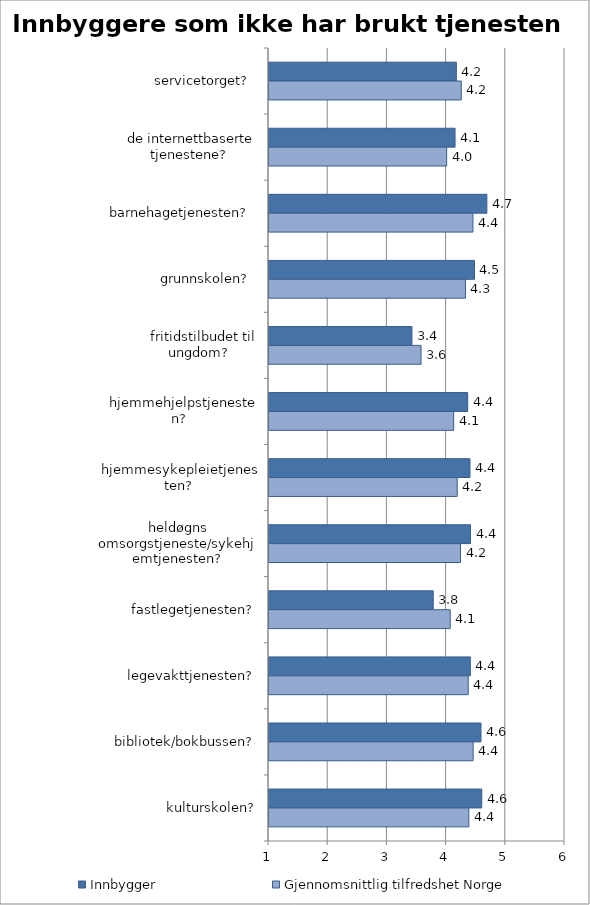
| Category | Innbygger | Gjennomsnittlig tilfredshet Norge |
|---|---|---|
|  servicetorget?  | 4.165 | 4.248 |
| de internettbaserte tjenestene?  | 4.143 | 4.001 |
| barnehagetjenesten?  | 4.68 | 4.446 |
|  grunnskolen?  | 4.471 | 4.319 |
|  fritidstilbudet til ungdom?  | 3.414 | 3.568 |
|  hjemmehjelpstjenesten?  | 4.356 | 4.12 |
|  hjemmesykepleietjenesten? | 4.395 | 4.179 |
|  heldøgns omsorgstjeneste/sykehjemtjenesten? | 4.404 | 4.235 |
|  fastlegetjenesten? | 3.774 | 4.061 |
|  legevakttjenesten? | 4.401 | 4.365 |
| bibliotek/bokbussen? | 4.581 | 4.448 |
| kulturskolen? | 4.594 | 4.376 |